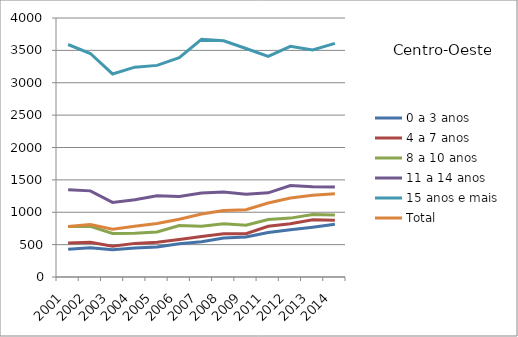
| Category | 0 a 3 anos | 4 a 7 anos | 8 a 10 anos | 11 a 14 anos | 15 anos e mais | Total |
|---|---|---|---|---|---|---|
| 2001.0 | 427.9 | 523.7 | 781.2 | 1345.8 | 3590.9 | 779.9 |
| 2002.0 | 453.4 | 537.3 | 782.2 | 1330.1 | 3451.5 | 809.3 |
| 2003.0 | 421.3 | 475.9 | 671.1 | 1152.6 | 3135.7 | 736.2 |
| 2004.0 | 449.6 | 519.2 | 677.4 | 1193.8 | 3240.4 | 784 |
| 2005.0 | 461.9 | 536.2 | 694.8 | 1253.8 | 3268.2 | 827.9 |
| 2006.0 | 514 | 578.9 | 793.6 | 1242.7 | 3386.9 | 891 |
| 2007.0 | 545.5 | 625.5 | 784.9 | 1296.8 | 3669.7 | 972 |
| 2008.0 | 603.7 | 667.3 | 823.8 | 1313.9 | 3647.8 | 1028.4 |
| 2009.0 | 617.2 | 668.6 | 799 | 1278.5 | 3529 | 1038.1 |
| 2011.0 | 688.1 | 783.8 | 888.2 | 1300 | 3406.8 | 1143.4 |
| 2012.0 | 729.3 | 823.8 | 909.4 | 1412.5 | 3562.1 | 1221.3 |
| 2013.0 | 769.3 | 883 | 965.3 | 1393.6 | 3505.9 | 1261.6 |
| 2014.0 | 813.1 | 877.8 | 958.6 | 1388.2 | 3607.3 | 1287.5 |